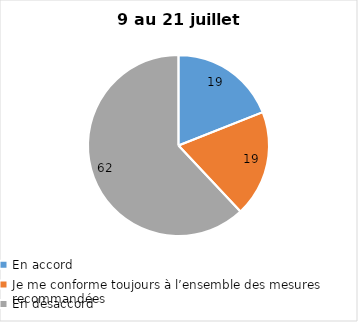
| Category | Series 0 |
|---|---|
| En accord | 19 |
| Je me conforme toujours à l’ensemble des mesures recommandées | 19 |
| En désaccord | 62 |